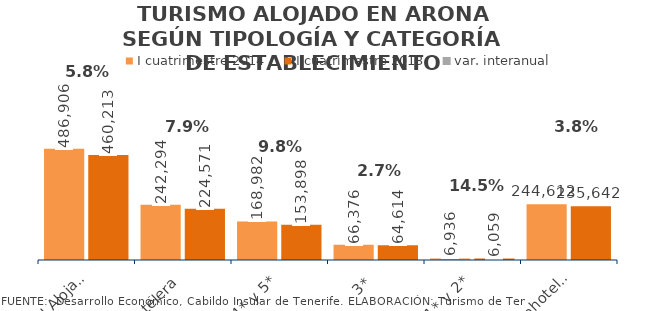
| Category | I cuatrimestre 2014 | I cuatrimestre 2013 |
|---|---|---|
| Total Alojados | 486906 | 460213 |
| Hotelera | 242294 | 224571 |
| 4* y 5* | 168982 | 153898 |
| 3* | 66376 | 64614 |
| 1* y 2* | 6936 | 6059 |
| Extrahotelera | 244612 | 235642 |